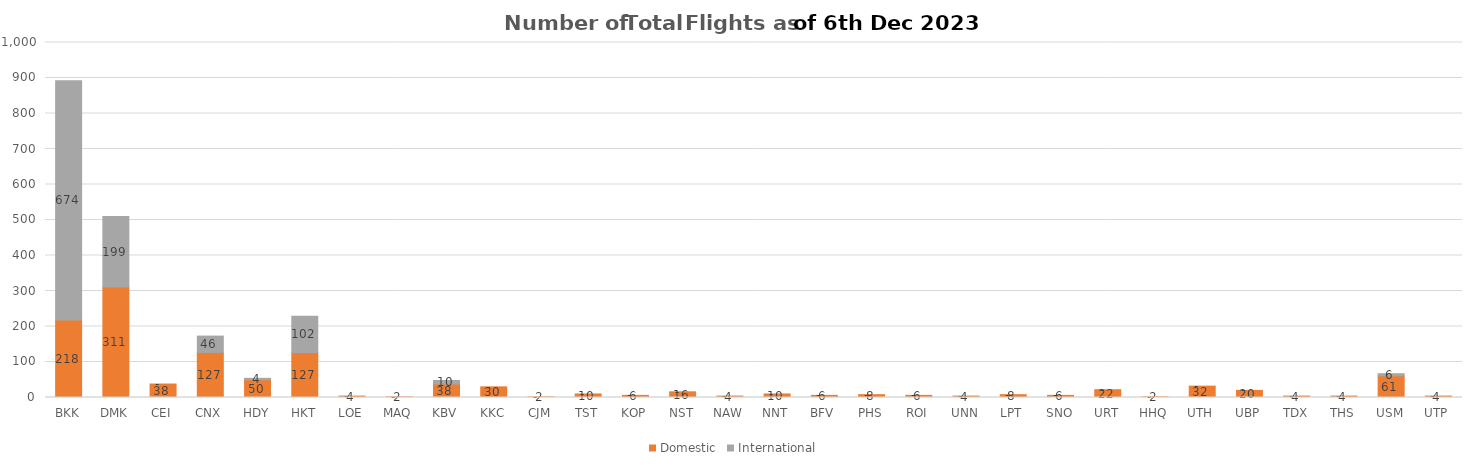
| Category | Domestic | International |
|---|---|---|
| BKK | 218 | 674 |
| DMK | 311 | 199 |
| CEI | 38 | 0 |
| CNX | 127 | 46 |
| HDY | 50 | 4 |
| HKT | 127 | 102 |
| LOE | 4 | 0 |
| MAQ | 2 | 0 |
| KBV | 38 | 10 |
| KKC | 30 | 0 |
| CJM | 2 | 0 |
| TST | 10 | 0 |
| KOP | 6 | 0 |
| NST | 16 | 0 |
| NAW | 4 | 0 |
| NNT | 10 | 0 |
| BFV | 6 | 0 |
| PHS | 8 | 0 |
| ROI | 6 | 0 |
| UNN | 4 | 0 |
| LPT | 8 | 0 |
| SNO | 6 | 0 |
| URT | 22 | 0 |
| HHQ | 2 | 0 |
| UTH | 32 | 0 |
| UBP | 20 | 0 |
| TDX | 4 | 0 |
| THS | 4 | 0 |
| USM | 61 | 6 |
| UTP | 4 | 0 |